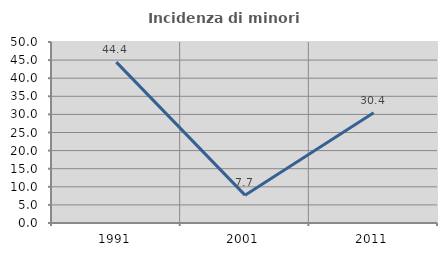
| Category | Incidenza di minori stranieri |
|---|---|
| 1991.0 | 44.444 |
| 2001.0 | 7.692 |
| 2011.0 | 30.435 |